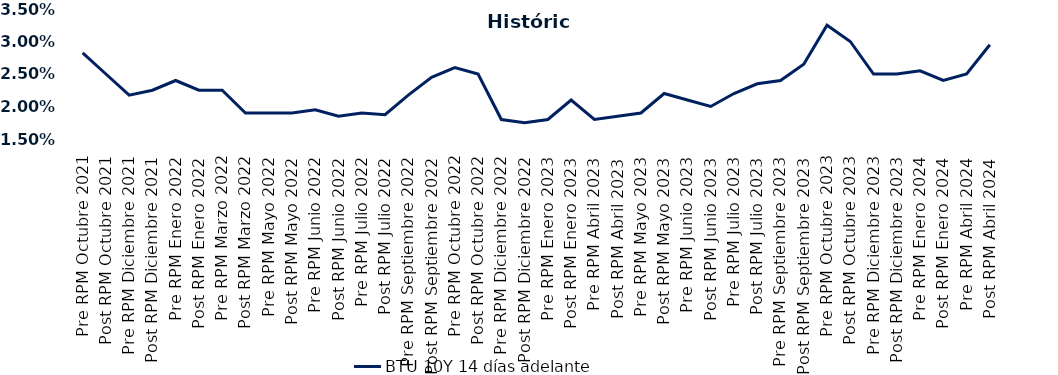
| Category | BTU 10Y 14 días adelante |
|---|---|
| Pre RPM Octubre 2021 | 0.028 |
| Post RPM Octubre 2021 | 0.025 |
| Pre RPM Diciembre 2021 | 0.022 |
| Post RPM Diciembre 2021 | 0.022 |
| Pre RPM Enero 2022 | 0.024 |
| Post RPM Enero 2022 | 0.022 |
| Pre RPM Marzo 2022 | 0.022 |
| Post RPM Marzo 2022 | 0.019 |
| Pre RPM Mayo 2022 | 0.019 |
| Post RPM Mayo 2022 | 0.019 |
| Pre RPM Junio 2022 | 0.02 |
| Post RPM Junio 2022 | 0.018 |
| Pre RPM Julio 2022 | 0.019 |
| Post RPM Julio 2022 | 0.019 |
| Pre RPM Septiembre 2022 | 0.022 |
| Post RPM Septiembre 2022 | 0.024 |
| Pre RPM Octubre 2022 | 0.026 |
| Post RPM Octubre 2022 | 0.025 |
| Pre RPM Diciembre 2022 | 0.018 |
| Post RPM Diciembre 2022 | 0.018 |
| Pre RPM Enero 2023 | 0.018 |
| Post RPM Enero 2023 | 0.021 |
| Pre RPM Abril 2023 | 0.018 |
| Post RPM Abril 2023 | 0.018 |
| Pre RPM Mayo 2023 | 0.019 |
| Post RPM Mayo 2023 | 0.022 |
| Pre RPM Junio 2023 | 0.021 |
| Post RPM Junio 2023 | 0.02 |
| Pre RPM Julio 2023 | 0.022 |
| Post RPM Julio 2023 | 0.024 |
| Pre RPM Septiembre 2023 | 0.024 |
| Post RPM Septiembre 2023 | 0.026 |
| Pre RPM Octubre 2023 | 0.032 |
| Post RPM Octubre 2023 | 0.03 |
| Pre RPM Diciembre 2023 | 0.025 |
| Post RPM Diciembre 2023 | 0.025 |
| Pre RPM Enero 2024 | 0.026 |
| Post RPM Enero 2024 | 0.024 |
| Pre RPM Abril 2024 | 0.025 |
| Post RPM Abril 2024 | 0.03 |